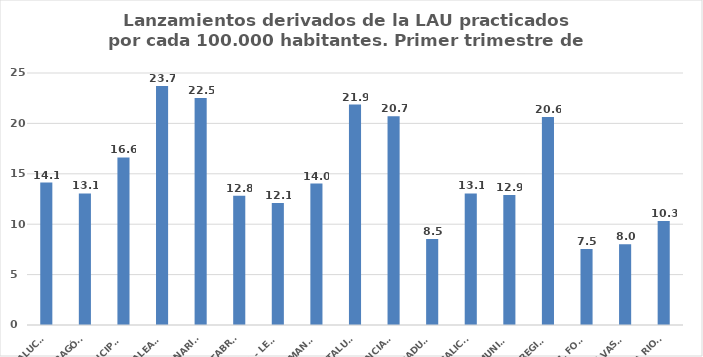
| Category | Series 0 |
|---|---|
| ANDALUCÍA | 14.131 |
| ARAGÓN | 13.053 |
| ASTURIAS, PRINCIPADO | 16.625 |
| ILLES BALEARS | 23.719 |
| CANARIAS | 22.514 |
| CANTABRIA | 12.816 |
| CASTILLA - LEÓN | 12.109 |
| CASTILLA - LA MANCHA | 14.034 |
| CATALUÑA | 21.867 |
| C. VALENCIANA | 20.704 |
| EXTREMADURA | 8.537 |
| GALICIA | 13.052 |
| MADRID, COMUNIDAD | 12.885 |
| MURCIA, REGIÓN | 20.634 |
| NAVARRA, COM. FORAL | 7.535 |
| PAÍS VASCO | 8.019 |
| LA RIOJA | 10.329 |